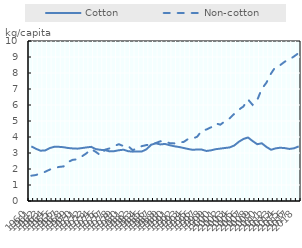
| Category | Cotton | Non-cotton |
|---|---|---|
| 1960.0 | 3.414 | 1.581 |
| 1961.0 | 3.263 | 1.623 |
| 1962.0 | 3.144 | 1.726 |
| 1963.0 | 3.161 | 1.824 |
| 1964.0 | 3.308 | 1.963 |
| 1965.0 | 3.389 | 2.055 |
| 1966.0 | 3.386 | 2.129 |
| 1967.0 | 3.362 | 2.161 |
| 1968.0 | 3.312 | 2.441 |
| 1969.0 | 3.285 | 2.575 |
| 1970.0 | 3.271 | 2.604 |
| 1971.0 | 3.309 | 2.793 |
| 1972.0 | 3.35 | 2.989 |
| 1973.0 | 3.383 | 3.245 |
| 1974.0 | 3.244 | 3.068 |
| 1975.0 | 3.198 | 2.861 |
| 1976.0 | 3.18 | 3.208 |
| 1977.0 | 3.101 | 3.289 |
| 1978.0 | 3.117 | 3.446 |
| 1979.0 | 3.172 | 3.548 |
| 1980.0 | 3.206 | 3.428 |
| 1981.0 | 3.113 | 3.439 |
| 1982.0 | 3.085 | 3.171 |
| 1983.0 | 3.094 | 3.322 |
| 1984.0 | 3.098 | 3.431 |
| 1985.0 | 3.235 | 3.497 |
| 1986.0 | 3.518 | 3.525 |
| 1987.0 | 3.605 | 3.624 |
| 1988.0 | 3.536 | 3.732 |
| 1989.0 | 3.567 | 3.73 |
| 1990.0 | 3.489 | 3.617 |
| 1991.0 | 3.423 | 3.6 |
| 1992.0 | 3.377 | 3.678 |
| 1993.0 | 3.317 | 3.68 |
| 1994.0 | 3.251 | 3.874 |
| 1995.0 | 3.199 | 3.889 |
| 1996.0 | 3.22 | 4.026 |
| 1997.0 | 3.211 | 4.403 |
| 1998.0 | 3.127 | 4.471 |
| 1999.0 | 3.168 | 4.607 |
| 2000.0 | 3.238 | 4.852 |
| 2001.0 | 3.275 | 4.77 |
| 2002.0 | 3.313 | 4.984 |
| 2003.0 | 3.347 | 5.164 |
| 2004.0 | 3.464 | 5.439 |
| 2005.0 | 3.698 | 5.706 |
| 2006.0 | 3.875 | 5.905 |
| 2007.0 | 3.97 | 6.348 |
| 2008.0 | 3.749 | 6.008 |
| 2009.0 | 3.549 | 6.306 |
| 2010.0 | 3.607 | 7.012 |
| 2011.0 | 3.379 | 7.397 |
| 2012.0 | 3.203 | 7.966 |
| 2013.0 | 3.288 | 8.395 |
| 2014.0 | 3.33 | 8.496 |
| 2015.0 | 3.305 | 8.712 |
| 2016.0 | 3.254 | 8.852 |
| 2017.0 | 3.295 | 9.038 |
| 2018.0 | 3.413 | 9.25 |